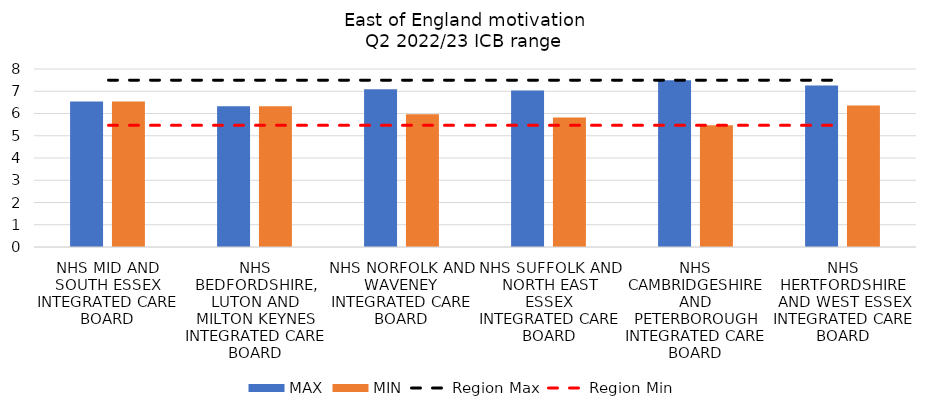
| Category | MAX | MIN |
|---|---|---|
| NHS MID AND SOUTH ESSEX INTEGRATED CARE BOARD | 6.54 | 6.54 |
| NHS BEDFORDSHIRE, LUTON AND MILTON KEYNES INTEGRATED CARE BOARD | 6.322 | 6.322 |
| NHS NORFOLK AND WAVENEY INTEGRATED CARE BOARD | 7.095 | 5.963 |
| NHS SUFFOLK AND NORTH EAST ESSEX INTEGRATED CARE BOARD | 7.029 | 5.816 |
| NHS CAMBRIDGESHIRE AND PETERBOROUGH INTEGRATED CARE BOARD | 7.5 | 5.471 |
| NHS HERTFORDSHIRE AND WEST ESSEX INTEGRATED CARE BOARD | 7.254 | 6.361 |